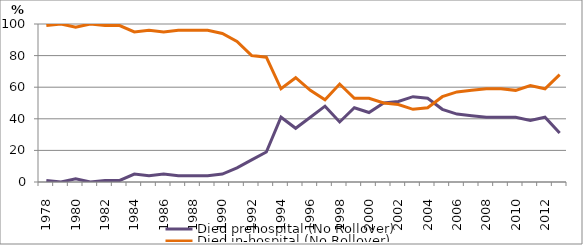
| Category | Died prehospital (No Rollover) | Died in-hospital (No Rollover) |
|---|---|---|
| 1978.0 | 1 | 99 |
| 1979.0 | 0 | 100 |
| 1980.0 | 2 | 98 |
| 1981.0 | 0 | 100 |
| 1982.0 | 1 | 99 |
| 1983.0 | 1 | 99 |
| 1984.0 | 5 | 95 |
| 1985.0 | 4 | 96 |
| 1986.0 | 5 | 95 |
| 1987.0 | 4 | 96 |
| 1988.0 | 4 | 96 |
| 1989.0 | 4 | 96 |
| 1990.0 | 5 | 94 |
| 1991.0 | 9 | 89 |
| 1992.0 | 14 | 80 |
| 1993.0 | 19 | 79 |
| 1994.0 | 41 | 59 |
| 1995.0 | 34 | 66 |
| 1996.0 | 41 | 58 |
| 1997.0 | 48 | 52 |
| 1998.0 | 38 | 62 |
| 1999.0 | 47 | 53 |
| 2000.0 | 44 | 53 |
| 2001.0 | 50 | 50 |
| 2002.0 | 51 | 49 |
| 2003.0 | 54 | 46 |
| 2004.0 | 53 | 47 |
| 2005.0 | 46 | 54 |
| 2006.0 | 43 | 57 |
| 2007.0 | 42 | 58 |
| 2008.0 | 41 | 59 |
| 2009.0 | 41 | 59 |
| 2010.0 | 41 | 58 |
| 2011.0 | 39 | 61 |
| 2012.0 | 41 | 59 |
| 2013.0 | 31 | 68 |